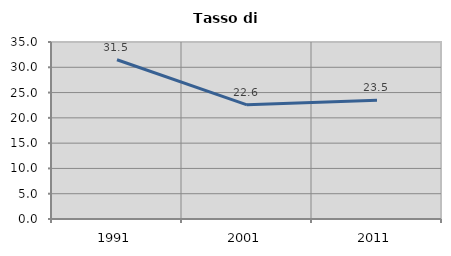
| Category | Tasso di disoccupazione   |
|---|---|
| 1991.0 | 31.485 |
| 2001.0 | 22.568 |
| 2011.0 | 23.504 |